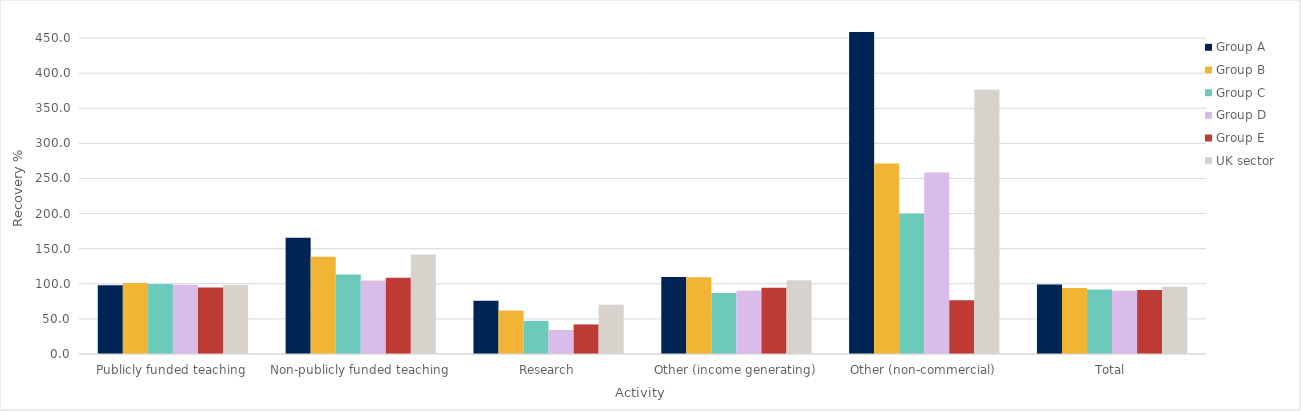
| Category | Group A | Group B | Group C | Group D | Group E | UK sector |
|---|---|---|---|---|---|---|
| Publicly funded teaching | 97.757 | 101.097 | 99.615 | 98.743 | 94.691 | 98.25 |
| Non-publicly funded teaching | 165.684 | 138.353 | 113.364 | 104.566 | 108.716 | 141.619 |
| Research | 75.781 | 61.825 | 47.21 | 34.297 | 42.109 | 70.316 |
| Other (income generating) | 109.555 | 109.158 | 86.903 | 90.098 | 94.403 | 105.107 |
| Other (non-commercial) | 458.794 | 271.455 | 199.611 | 258.376 | 76.646 | 376.517 |
| Total | 98.878 | 94.169 | 91.975 | 90.077 | 91.043 | 95.923 |